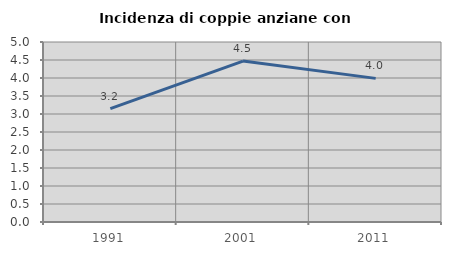
| Category | Incidenza di coppie anziane con figli |
|---|---|
| 1991.0 | 3.15 |
| 2001.0 | 4.47 |
| 2011.0 | 3.989 |